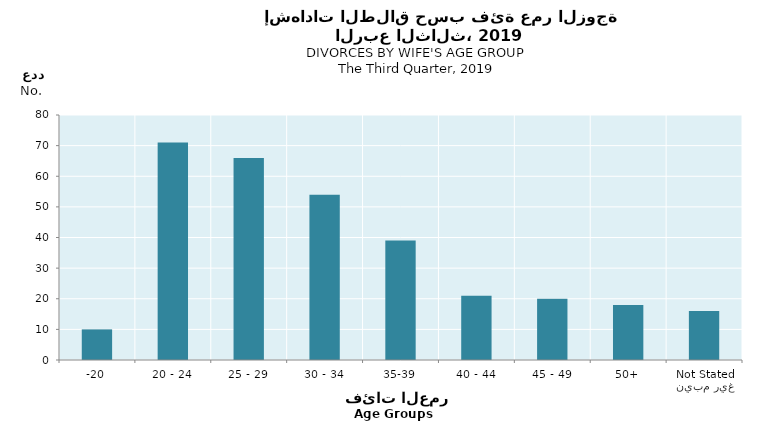
| Category | Series 0 |
|---|---|
| -20 | 10 |
| 20 - 24 | 71 |
| 25 - 29 | 66 |
| 30 - 34 | 54 |
| 35-39 | 39 |
| 40 - 44 | 21 |
| 45 - 49 | 20 |
| 50+ | 18 |
| غير مبين
Not Stated | 16 |